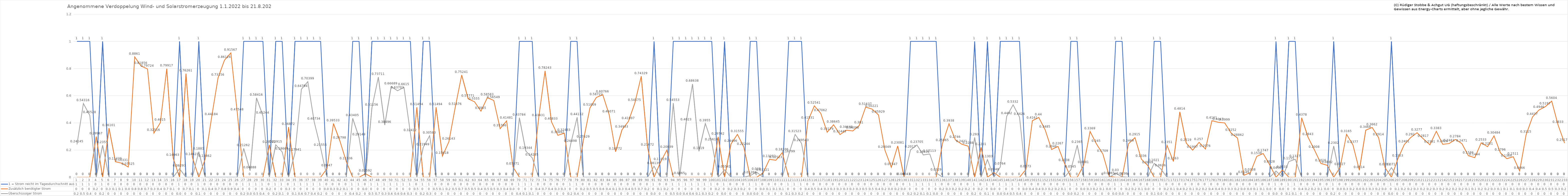
| Category | 1 = Strom reicht im Tagesdurchschnitt aus | Zusätzlich benötigter Strom | Überschüssiger Strom |
|---|---|---|---|
| 0 | 1 | 0 | 0.241 |
| 1 | 1 | 0 | 0.543 |
| 2 | 1 | 0 | 0.455 |
| 3 | 0 | 0.3 | 0 |
| 4 | 1 | 0 | 0.236 |
| 5 | 0 | 0.361 | 0 |
| 6 | 0 | 0.114 | 0 |
| 7 | 0 | 0.103 | 0 |
| 8 | 0 | 0.075 | 0 |
| 9 | 0 | 0.886 | 0 |
| 10 | 0 | 0.819 | 0 |
| 11 | 0 | 0.797 | 0 |
| 12 | 0 | 0.325 | 0 |
| 13 | 0 | 0.402 | 0 |
| 14 | 0 | 0.799 | 0 |
| 15 | 0 | 0.141 | 0 |
| 16 | 1 | 0 | 0.063 |
| 17 | 0 | 0.763 | 0 |
| 18 | 0 | 0.146 | 0 |
| 19 | 1 | 0 | 0.188 |
| 20 | 0 | 0.135 | 0 |
| 21 | 0 | 0.442 | 0 |
| 22 | 0 | 0.732 | 0 |
| 23 | 0 | 0.861 | 0 |
| 24 | 0 | 0.916 | 0 |
| 25 | 0 | 0.475 | 0 |
| 26 | 1 | 0 | 0.213 |
| 27 | 1 | 0 | 0.049 |
| 28 | 1 | 0 | 0.584 |
| 29 | 1 | 0 | 0.452 |
| 30 | 0 | 0.238 | 0 |
| 31 | 1 | 0 | 0.239 |
| 32 | 1 | 0 | 0.187 |
| 33 | 0 | 0.369 | 0 |
| 34 | 1 | 0 | 0.179 |
| 35 | 1 | 0 | 0.648 |
| 36 | 1 | 0 | 0.704 |
| 37 | 1 | 0 | 0.407 |
| 38 | 1 | 0 | 0.216 |
| 39 | 0 | 0.065 | 0 |
| 40 | 0 | 0.395 | 0 |
| 41 | 0 | 0.268 | 0 |
| 42 | 0 | 0.115 | 0 |
| 43 | 1 | 0 | 0.434 |
| 44 | 1 | 0 | 0.291 |
| 45 | 0 | 0.026 | 0 |
| 46 | 1 | 0 | 0.512 |
| 47 | 1 | 0 | 0.737 |
| 48 | 1 | 0 | 0.385 |
| 49 | 1 | 0 | 0.667 |
| 50 | 1 | 0 | 0.637 |
| 51 | 1 | 0 | 0.661 |
| 52 | 1 | 0 | 0.324 |
| 53 | 0 | 0.515 | 0 |
| 54 | 1 | 0 | 0.219 |
| 55 | 1 | 0 | 0.306 |
| 56 | 0 | 0.515 | 0 |
| 57 | 0 | 0.156 | 0 |
| 58 | 0 | 0.261 | 0 |
| 59 | 0 | 0.517 | 0 |
| 60 | 0 | 0.752 | 0 |
| 61 | 0 | 0.578 | 0 |
| 62 | 0 | 0.556 | 0 |
| 63 | 0 | 0.487 | 0 |
| 64 | 0 | 0.586 | 0 |
| 65 | 0 | 0.565 | 0 |
| 66 | 0 | 0.358 | 0 |
| 67 | 0 | 0.415 | 0 |
| 68 | 0 | 0.077 | 0 |
| 69 | 1 | 0 | 0.438 |
| 70 | 1 | 0 | 0.193 |
| 71 | 1 | 0 | 0.143 |
| 72 | 0 | 0.434 | 0 |
| 73 | 0 | 0.782 | 0 |
| 74 | 0 | 0.408 | 0 |
| 75 | 0 | 0.309 | 0 |
| 76 | 0 | 0.325 | 0 |
| 77 | 1 | 0 | 0.245 |
| 78 | 1 | 0 | 0.441 |
| 79 | 0 | 0.276 | 0 |
| 80 | 0 | 0.51 | 0 |
| 81 | 0 | 0.587 | 0 |
| 82 | 0 | 0.608 | 0 |
| 83 | 0 | 0.461 | 0 |
| 84 | 0 | 0.188 | 0 |
| 85 | 0 | 0.349 | 0 |
| 86 | 0 | 0.411 | 0 |
| 87 | 0 | 0.546 | 0 |
| 88 | 0 | 0.743 | 0 |
| 89 | 0 | 0.217 | 0 |
| 90 | 1 | 0 | 0.081 |
| 91 | 0 | 0.11 | 0 |
| 92 | 0 | 0.2 | 0 |
| 93 | 1 | 0 | 0.546 |
| 94 | 1 | 0 | 0.006 |
| 95 | 1 | 0 | 0.402 |
| 96 | 1 | 0 | 0.686 |
| 97 | 1 | 0 | 0.192 |
| 98 | 1 | 0 | 0.396 |
| 99 | 1 | 0 | 0.256 |
| 100 | 0 | 0.297 | 0 |
| 101 | 1 | 0 | 0.055 |
| 102 | 0 | 0.245 | 0 |
| 103 | 0 | 0.316 | 0 |
| 104 | 0 | 0.222 | 0 |
| 105 | 1 | 0 | 0.013 |
| 106 | 1 | 0 | 0.038 |
| 107 | 0 | 0.031 | 0 |
| 108 | 0 | 0.132 | 0 |
| 109 | 0 | 0.125 | 0 |
| 110 | 0 | 0.181 | 0 |
| 111 | 1 | 0 | 0.168 |
| 112 | 1 | 0 | 0.315 |
| 113 | 1 | 0 | 0.25 |
| 114 | 0 | 0.415 | 0 |
| 115 | 0 | 0.525 | 0 |
| 116 | 0 | 0.471 | 0 |
| 117 | 0 | 0.332 | 0 |
| 118 | 0 | 0.386 | 0 |
| 119 | 0 | 0.314 | 0 |
| 120 | 0 | 0.346 | 0 |
| 121 | 0 | 0.341 | 0 |
| 122 | 0 | 0.381 | 0 |
| 123 | 0 | 0.516 | 0 |
| 124 | 0 | 0.502 | 0 |
| 125 | 0 | 0.459 | 0 |
| 126 | 0 | 0.2 | 0 |
| 127 | 0 | 0.073 | 0 |
| 128 | 0 | 0.231 | 0 |
| 129 | 0 | 0 | 0 |
| 130 | 1 | 0 | 0.202 |
| 131 | 1 | 0 | 0.237 |
| 132 | 1 | 0 | 0.164 |
| 133 | 1 | 0 | 0.171 |
| 134 | 1 | 0 | 0.033 |
| 135 | 0 | 0.251 | 0 |
| 136 | 0 | 0.394 | 0 |
| 137 | 0 | 0.275 | 0 |
| 138 | 0 | 0.243 | 0 |
| 139 | 0 | 0.229 | 0 |
| 140 | 1 | 0 | 0.293 |
| 141 | 0 | 0.22 | 0 |
| 142 | 1 | 0 | 0.13 |
| 143 | 0 | 0.035 | 0 |
| 144 | 1 | 0 | 0.076 |
| 145 | 1 | 0 | 0.449 |
| 146 | 1 | 0 | 0.533 |
| 147 | 1 | 0 | 0.442 |
| 148 | 0 | 0.057 | 0 |
| 149 | 0 | 0.416 | 0 |
| 150 | 0 | 0.44 | 0 |
| 151 | 0 | 0.348 | 0 |
| 152 | 0 | 0.205 | 0 |
| 153 | 0 | 0.227 | 0 |
| 154 | 0 | 0.104 | 0 |
| 155 | 1 | 0 | 0.054 |
| 156 | 1 | 0 | 0.237 |
| 157 | 0 | 0.088 | 0 |
| 158 | 0 | 0.337 | 0 |
| 159 | 0 | 0.245 | 0 |
| 160 | 0 | 0.171 | 0 |
| 161 | 0 | 0.007 | 0 |
| 162 | 1 | 0 | 0.03 |
| 163 | 1 | 0 | 0.004 |
| 164 | 0 | 0.247 | 0 |
| 165 | 0 | 0.292 | 0 |
| 166 | 0 | 0.134 | 0 |
| 167 | 0 | 0.087 | 0 |
| 168 | 1 | 0 | 0.102 |
| 169 | 1 | 0 | 0.064 |
| 170 | 0 | 0.235 | 0 |
| 171 | 0 | 0.116 | 0 |
| 172 | 0 | 0.481 | 0 |
| 173 | 0 | 0.252 | 0 |
| 174 | 0 | 0.2 | 0 |
| 175 | 0 | 0.257 | 0 |
| 176 | 0 | 0.208 | 0 |
| 177 | 0 | 0.416 | 0 |
| 178 | 0 | 0.405 | 0 |
| 179 | 0 | 0.4 | 0 |
| 180 | 0 | 0.325 | 0 |
| 181 | 0 | 0.289 | 0 |
| 182 | 0 | 0.015 | 0 |
| 183 | 0 | 0.034 | 0 |
| 184 | 0 | 0.154 | 0 |
| 185 | 0 | 0.175 | 0 |
| 186 | 0 | 0.093 | 0 |
| 187 | 1 | 0 | 0.046 |
| 188 | 0 | 0.053 | 0 |
| 189 | 1 | 0 | 0.115 |
| 190 | 1 | 0 | 0.133 |
| 191 | 0 | 0.438 | 0 |
| 192 | 0 | 0.294 | 0 |
| 193 | 0 | 0.201 | 0 |
| 194 | 0 | 0.102 | 0 |
| 195 | 0 | 0.088 | 0 |
| 196 | 1 | 0 | 0.23 |
| 197 | 0 | 0.073 | 0 |
| 198 | 0 | 0.316 | 0 |
| 199 | 0 | 0.238 | 0 |
| 200 | 0 | 0.051 | 0 |
| 201 | 0 | 0.347 | 0 |
| 202 | 0 | 0.366 | 0 |
| 203 | 0 | 0.291 | 0 |
| 204 | 0 | 0.071 | 0 |
| 205 | 1 | 0 | 0.071 |
| 206 | 0 | 0.135 | 0 |
| 207 | 0 | 0.24 | 0 |
| 208 | 0 | 0.292 | 0 |
| 209 | 0 | 0.328 | 0 |
| 210 | 0 | 0.282 | 0 |
| 211 | 0 | 0.239 | 0 |
| 212 | 0 | 0.338 | 0 |
| 213 | 0 | 0.243 | 0 |
| 214 | 0 | 0.248 | 0 |
| 215 | 0 | 0.278 | 0 |
| 216 | 0 | 0.247 | 0 |
| 217 | 0 | 0.159 | 0 |
| 218 | 0 | 0.144 | 0 |
| 219 | 0 | 0.253 | 0 |
| 220 | 0 | 0.225 | 0 |
| 221 | 0 | 0.305 | 0 |
| 222 | 0 | 0.18 | 0 |
| 223 | 0 | 0.137 | 0 |
| 224 | 0 | 0.151 | 0 |
| 225 | 0 | 0.047 | 0 |
| 226 | 0 | 0.311 | 0 |
| 227 | 0 | 0.444 | 0 |
| 228 | 0 | 0.495 | 0 |
| 229 | 0 | 0.52 | 0 |
| 230 | 0 | 0.56 | 0 |
| 231 | 0 | 0.383 | 0 |
| 232 | 0 | 0.252 | 0 |